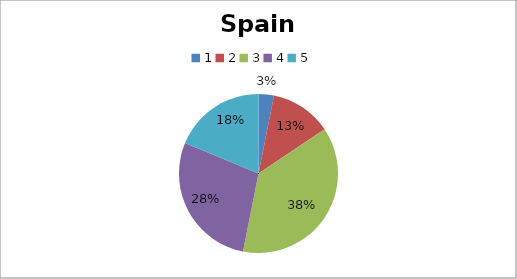
| Category | Spain |
|---|---|
| 0 | 1 |
| 1 | 4 |
| 2 | 12 |
| 3 | 9 |
| 4 | 6 |